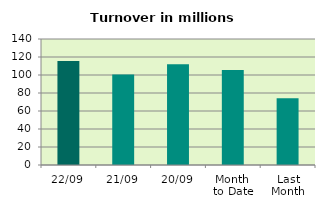
| Category | Series 0 |
|---|---|
| 22/09 | 115.502 |
| 21/09 | 100.658 |
| 20/09 | 111.983 |
| Month 
to Date | 105.445 |
| Last
Month | 74.221 |